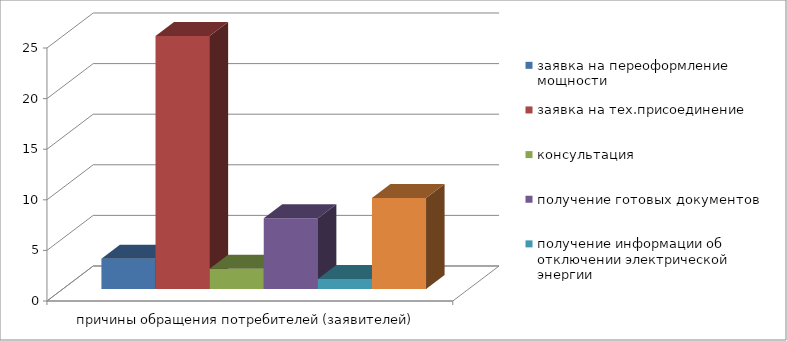
| Category | заявка на переоформление мощности | заявка на тех.присоединение | консультация  | получение готовых документов | получение информации об отключении электрической энергии | получение показаний прибора учета |
|---|---|---|---|---|---|---|
| 0 | 3 | 25 | 2 | 7 | 1 | 9 |